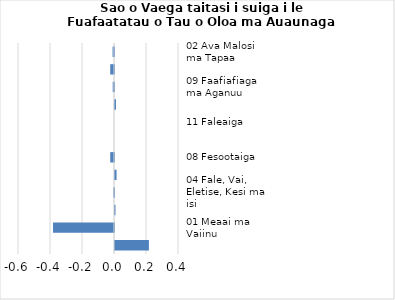
| Category |     Contributions |
|---|---|
| 02 Ava Malosi ma Tapaa | -0.009 |
| 05 Meafale, Mea Faigaluega mo Faaleleia o Aiga | -0.023 |
| 09 Faafiafiaga ma Aganuu | -0.008 |
| 06 Soifua Maloloina | 0.006 |
| 11 Faleaiga | 0 |
| 10 Aoaoga | 0 |
| 08 Fesootaiga | -0.023 |
| 12 Isi Oloa ma Auaunaga | 0.01 |
| 04 Fale, Vai, Eletise, Kesi ma isi | -0.004 |
| 03 Lavalava ma Seevae | 0.003 |
| 01 Meaai ma Vaiinu | -0.381 |
| 07 Femalagaiga | 0.212 |